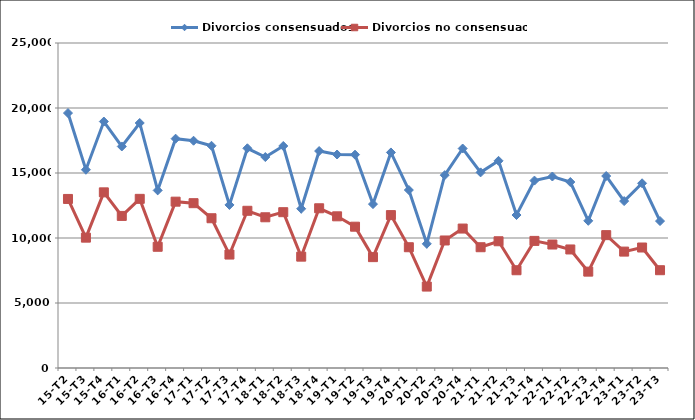
| Category | Divorcios consensuados | Divorcios no consensuados |
|---|---|---|
| 15-T2 | 19612 | 13004 |
| 15-T3 | 15249 | 10027 |
| 15-T4 | 18958 | 13512 |
| 16-T1 | 17041 | 11699 |
| 16-T2 | 18847 | 13011 |
| 16-T3 | 13660 | 9325 |
| 16-T4 | 17641 | 12795 |
| 17-T1 | 17483 | 12679 |
| 17-T2 | 17095 | 11520 |
| 17-T3 | 12545 | 8727 |
| 17-T4 | 16901 | 12093 |
| 18-T1 | 16226 | 11594 |
| 18-T2 | 17077 | 11986 |
| 18-T3 | 12249 | 8566 |
| 18-T4 | 16689 | 12287 |
| 19-T1 | 16423 | 11668 |
| 19-T2 | 16409 | 10869 |
| 19-T3 | 12607 | 8528 |
| 19-T4 | 16581 | 11761 |
| 20-T1 | 13690 | 9290 |
| 20-T2 | 9552 | 6264 |
| 20-T3 | 14835 | 9809 |
| 20-T4 | 16883 | 10727 |
| 21-T1 | 15048 | 9290 |
| 21-T2 | 15937 | 9750 |
| 21-T3 | 11767 | 7520 |
| 21-T4 | 14416 | 9777 |
| 22-T1 | 14730 | 9498 |
| 22-T2 | 14306 | 9118 |
| 22-T3 | 11321 | 7413 |
| 22-T4 | 14766 | 10221 |
| 23-T1 | 12839 | 8954 |
| 23-T2 | 14208 | 9269 |
| 23-T3 | 11303 | 7522 |